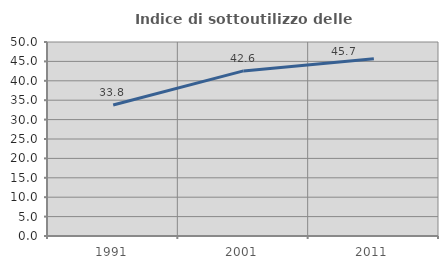
| Category | Indice di sottoutilizzo delle abitazioni  |
|---|---|
| 1991.0 | 33.754 |
| 2001.0 | 42.553 |
| 2011.0 | 45.708 |